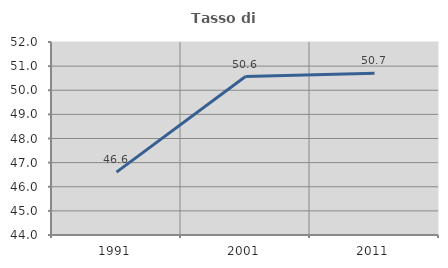
| Category | Tasso di occupazione   |
|---|---|
| 1991.0 | 46.606 |
| 2001.0 | 50.568 |
| 2011.0 | 50.706 |